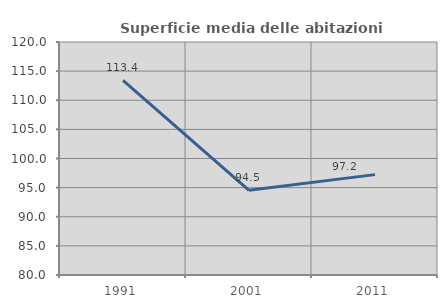
| Category | Superficie media delle abitazioni occupate |
|---|---|
| 1991.0 | 113.421 |
| 2001.0 | 94.548 |
| 2011.0 | 97.23 |